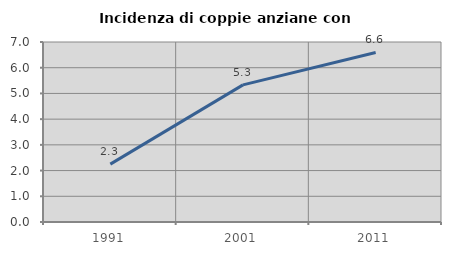
| Category | Incidenza di coppie anziane con figli |
|---|---|
| 1991.0 | 2.251 |
| 2001.0 | 5.333 |
| 2011.0 | 6.593 |